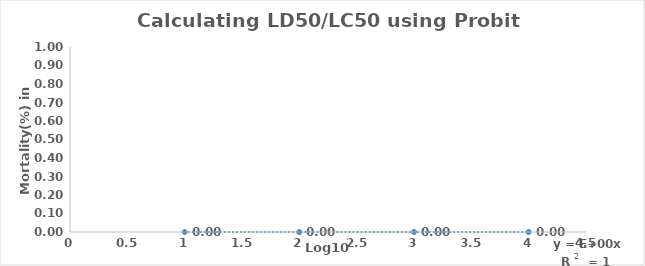
| Category | Calculating LD50/LC50 using Probit Analysis |
|---|---|
| 0.6020599913279624 | 3.718 |
| 0.6989700043360189 | 4.158 |
| 0.7781512503836436 | 4.476 |
| 0.8450980400142568 | 5 |